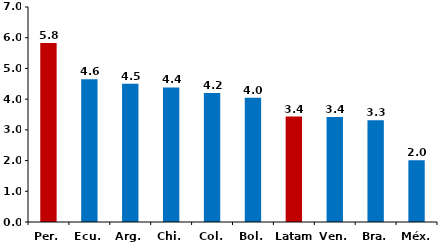
| Category | Series 0 |
|---|---|
| Per. | 5.826 |
| Ecu. | 4.648 |
| Arg. | 4.499 |
| Chi. | 4.381 |
| Col. | 4.199 |
| Bol. | 4.046 |
| Latam | 3.432 |
| Ven. | 3.419 |
| Bra. | 3.312 |
| Méx. | 2.012 |